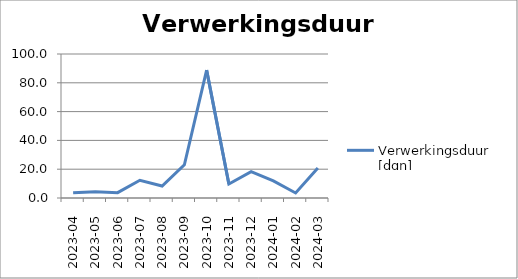
| Category | Verwerkingsduur [dgn] |
|---|---|
| 2023-04 | 3.563 |
| 2023-05 | 4.389 |
| 2023-06 | 3.7 |
| 2023-07 | 12.301 |
| 2023-08 | 8.327 |
| 2023-09 | 23.106 |
| 2023-10 | 88.789 |
| 2023-11 | 9.721 |
| 2023-12 | 18.29 |
| 2024-01 | 11.87 |
| 2024-02 | 3.488 |
| 2024-03 | 20.866 |